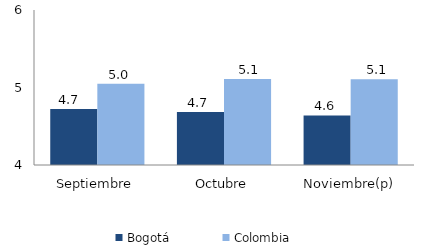
| Category | Bogotá | Colombia |
|---|---|---|
| Septiembre | 4.722 | 5.048 |
| Octubre | 4.683 | 5.111 |
| Noviembre(p) | 4.64 | 5.106 |